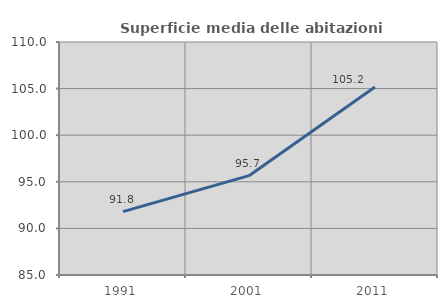
| Category | Superficie media delle abitazioni occupate |
|---|---|
| 1991.0 | 91.802 |
| 2001.0 | 95.66 |
| 2011.0 | 105.162 |